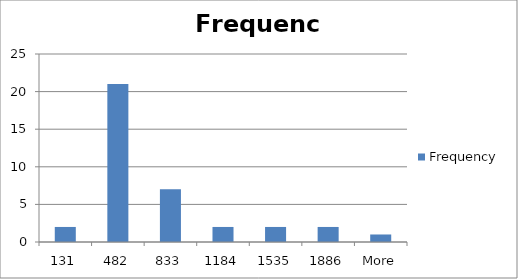
| Category | Frequency |
|---|---|
| 131 | 2 |
| 482 | 21 |
| 833 | 7 |
| 1184 | 2 |
| 1535 | 2 |
| 1886 | 2 |
| More | 1 |